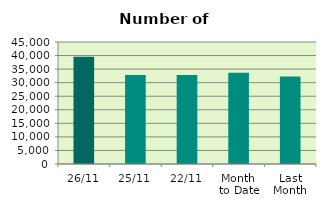
| Category | Series 0 |
|---|---|
| 26/11 | 39544 |
| 25/11 | 32806 |
| 22/11 | 32800 |
| Month 
to Date | 33621.444 |
| Last
Month | 32305.043 |